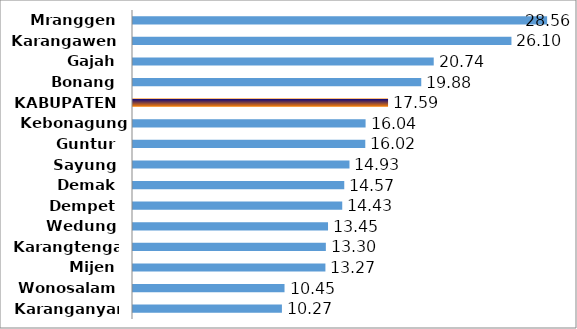
| Category | Series 0 |
|---|---|
| Karanganyar | 10.27 |
| Wonosalam | 10.45 |
| Mijen | 13.27 |
| Karangtengah | 13.3 |
| Wedung | 13.45 |
| Dempet | 14.43 |
| Demak | 14.57 |
| Sayung | 14.93 |
| Guntur | 16.02 |
| Kebonagung | 16.04 |
| KABUPATEN | 17.59 |
| Bonang | 19.88 |
| Gajah | 20.74 |
| Karangawen | 26.1 |
| Mranggen | 28.56 |